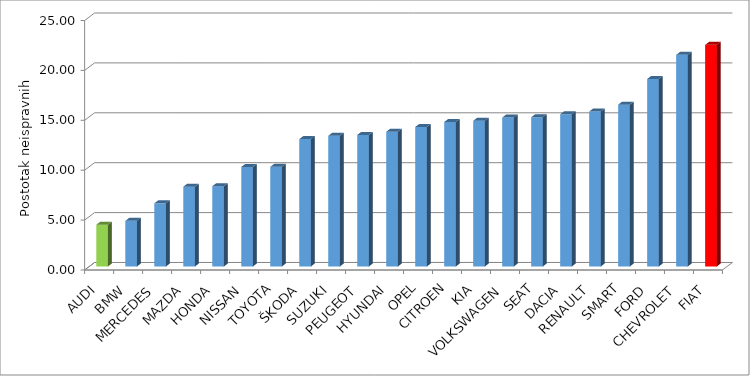
| Category | Series 4 |
|---|---|
| AUDI | 4.186 |
| BMW | 4.576 |
| MERCEDES | 6.331 |
| MAZDA | 7.996 |
| HONDA | 8.047 |
| NISSAN | 9.976 |
| TOYOTA | 9.985 |
| ŠKODA | 12.764 |
| SUZUKI | 13.098 |
| PEUGEOT | 13.183 |
| HYUNDAI | 13.504 |
| OPEL | 13.979 |
| CITROEN | 14.481 |
| KIA | 14.602 |
| VOLKSWAGEN | 14.923 |
| SEAT | 14.953 |
| DACIA | 15.256 |
| RENAULT | 15.527 |
| SMART | 16.215 |
| FORD | 18.788 |
| CHEVROLET | 21.21 |
| FIAT | 22.211 |